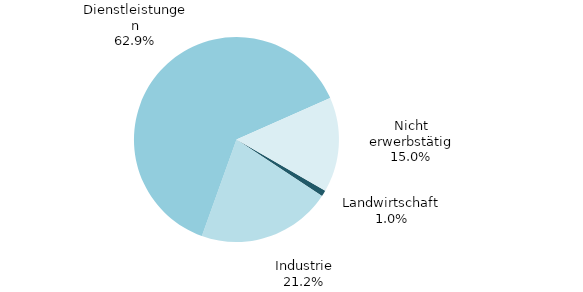
| Category | Series 0 |
|---|---|
| Landwirtschaft | 3 |
| Industrie | 65 |
| Dienstleistungen | 193 |
| Nicht erwerbstätig | 46 |